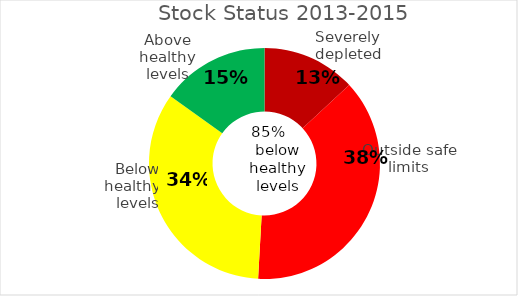
| Category | Series 0 |
|---|---|
| 0 | 52 |
| 1 | 150 |
| 2 | 135 |
| 3 | 60 |